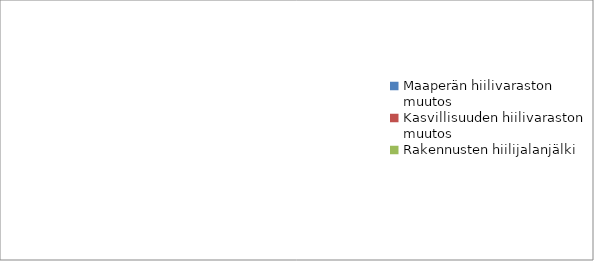
| Category | Series 0 |
|---|---|
| Maaperän hiilivaraston muutos | 0 |
| Kasvillisuuden hiilivaraston muutos | 0 |
| Rakennusten hiilijalanjälki | 0 |